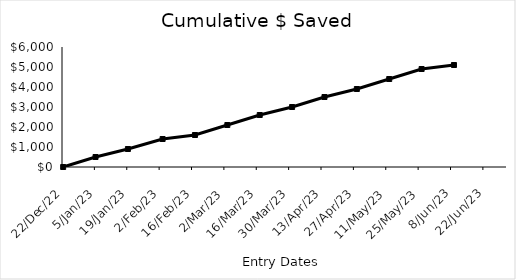
| Category | Series 0 |
|---|---|
| 2022-12-22 | 0 |
| 2023-01-05 | 500 |
| 2023-01-19 | 900 |
| 2023-02-03 | 1400 |
| 2023-02-17 | 1600 |
| 2023-03-03 | 2100 |
| 2023-03-17 | 2600 |
| 2023-03-31 | 3000 |
| 2023-04-14 | 3500 |
| 2023-04-28 | 3900 |
| 2023-05-12 | 4400 |
| 2023-05-26 | 4900 |
| 2023-06-09 | 5100 |